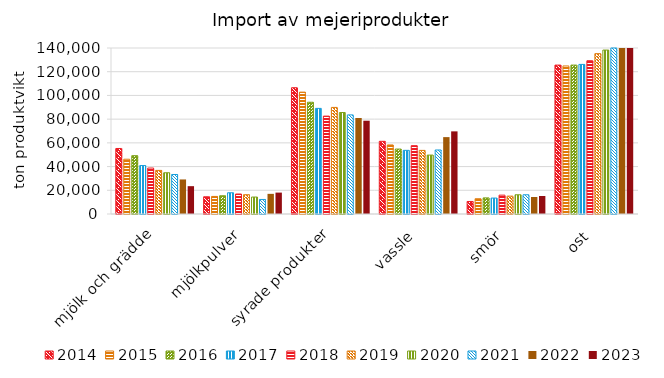
| Category | 2014 | 2015 | 2016 | 2017 | 2018 | 2019 | 2020 | 2021 | 2022 | 2023 |
|---|---|---|---|---|---|---|---|---|---|---|
| mjölk och grädde | 55255 | 46197 | 49186 | 40871 | 38756 | 36772 | 34784 | 33317 | 29135 | 23472 |
| mjölkpulver | 14525 | 14818 | 15396 | 17905 | 16848 | 16266 | 14301 | 12268 | 16994 | 18050 |
| syrade produkter | 106477 | 102778 | 94260 | 89081 | 82553 | 89892 | 85582 | 83560 | 80979 | 78675 |
| vassle | 61298 | 58244 | 54767 | 53681 | 57607 | 53635 | 49689 | 53984 | 64843 | 69694 |
| smör | 10566 | 12877 | 13574 | 13429 | 15895 | 15068 | 16219 | 16220 | 14336 | 15186 |
| ost | 125581 | 124859 | 125593 | 126163 | 129270 | 135239 | 138255 | 141547 | 147486 | 153340 |